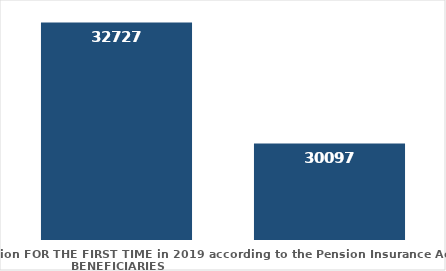
| Category | broj korisnika |
|---|---|
| Pension beneficiaries entitled to pension FOR THE FIRST TIME in 2019 according to the Pension Insurance Act  - NEW BENEFICIARIES | 32727 |
| Pension beneficiaries whose pension entitlement ceased in 2019  -  death caused,   
and who were retired according to the Pension Insurance Act   | 30097 |